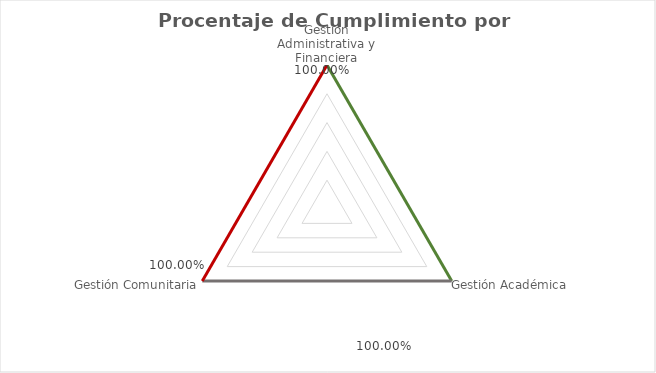
| Category | Series 0 |
|---|---|
| Gestión Administrativa y Financiera | 1 |
| Gestión Académica | 1 |
| Gestión Comunitaria | 1 |